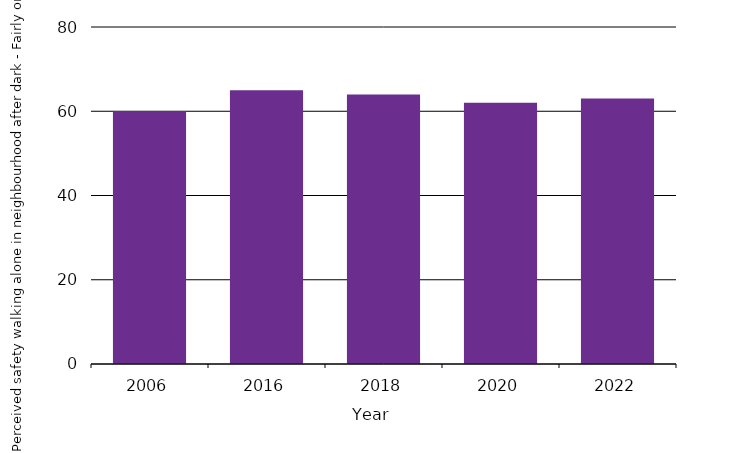
| Category | Perceived safety walking alone in neighbourhood after dark - Fairly or very safe |
|---|---|
| 2006.0 | 60 |
| 2016.0 | 65 |
| 2018.0 | 64 |
| 2020.0 | 62 |
| 2022.0 | 63 |